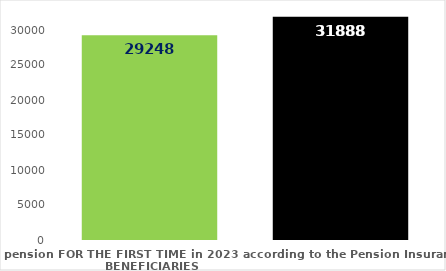
| Category | broj korisnika |
|---|---|
| Pension beneficiaries entitled to pension FOR THE FIRST TIME in 2023 according to the Pension Insurance Act  - NEW BENEFICIARIES | 29248 |
| Pension beneficiaries whose pension entitlement ceased in 2023  -  death caused,   
and who were retired according to the Pension Insurance Act   | 31888 |